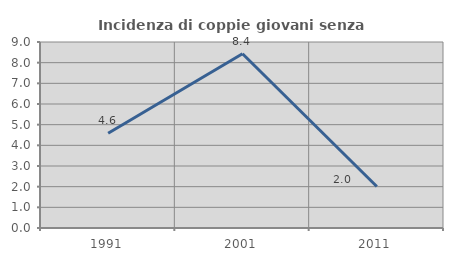
| Category | Incidenza di coppie giovani senza figli |
|---|---|
| 1991.0 | 4.587 |
| 2001.0 | 8.434 |
| 2011.0 | 2.008 |